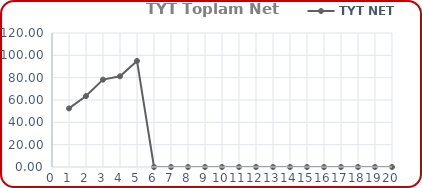
| Category | TYT NET |
|---|---|
| 0 | 52.5 |
| 1 | 63.5 |
| 2 | 78.25 |
| 3 | 81.25 |
| 4 | 95 |
| 5 | 0 |
| 6 | 0 |
| 7 | 0 |
| 8 | 0 |
| 9 | 0 |
| 10 | 0 |
| 11 | 0 |
| 12 | 0 |
| 13 | 0 |
| 14 | 0 |
| 15 | 0 |
| 16 | 0 |
| 17 | 0 |
| 18 | 0 |
| 19 | 0 |